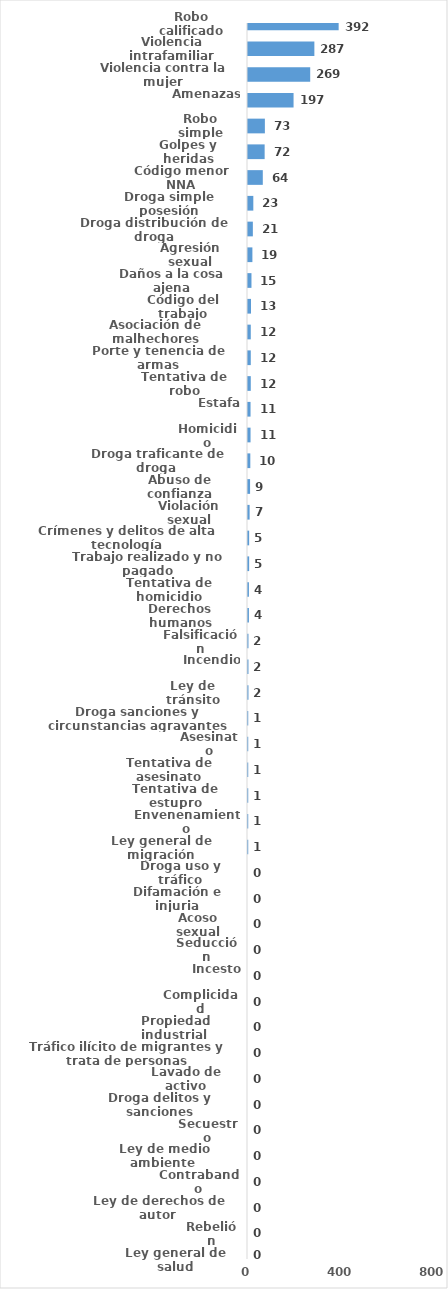
| Category | Series 0 |
|---|---|
| Robo calificado | 392 |
| Violencia intrafamiliar | 287 |
| Violencia contra la mujer | 269 |
| Amenazas | 197 |
| Robo simple | 73 |
| Golpes y heridas | 72 |
| Código menor NNA | 64 |
| Droga simple posesión | 23 |
| Droga distribución de droga | 21 |
| Agresión sexual | 19 |
| Daños a la cosa ajena | 15 |
| Código del trabajo | 13 |
| Asociación de malhechores | 12 |
| Porte y tenencia de armas | 12 |
| Tentativa de robo | 12 |
| Estafa | 11 |
| Homicidio | 11 |
| Droga traficante de droga  | 10 |
| Abuso de confianza | 9 |
| Violación sexual | 7 |
| Crímenes y delitos de alta tecnología | 5 |
| Trabajo realizado y no pagado | 5 |
| Tentativa de homicidio | 4 |
| Derechos humanos | 4 |
| Falsificación | 2 |
| Incendio | 2 |
| Ley de tránsito | 2 |
| Droga sanciones y circunstancias agravantes | 1 |
| Asesinato | 1 |
| Tentativa de asesinato | 1 |
| Tentativa de estupro | 1 |
| Envenenamiento | 1 |
| Ley general de migración | 1 |
| Droga uso y tráfico | 0 |
| Difamación e injuria | 0 |
| Acoso sexual | 0 |
| Seducción | 0 |
| Incesto | 0 |
| Complicidad | 0 |
| Propiedad industrial  | 0 |
| Tráfico ilícito de migrantes y trata de personas | 0 |
| Lavado de activo | 0 |
| Droga delitos y sanciones | 0 |
| Secuestro | 0 |
| Ley de medio ambiente  | 0 |
| Contrabando | 0 |
| Ley de derechos de autor  | 0 |
| Rebelión | 0 |
| Ley general de salud | 0 |